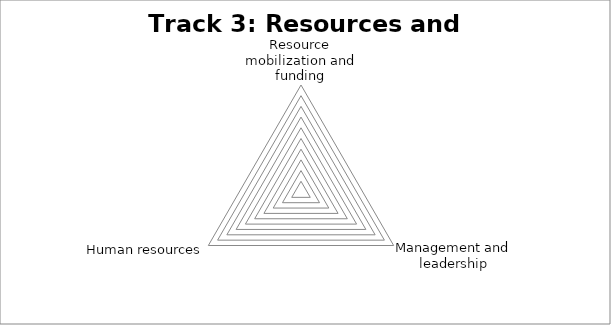
| Category | Series 0 |
|---|---|
| Resource mobilization and funding | 0 |
| Management and leadership | 0 |
| Human resources | 0 |